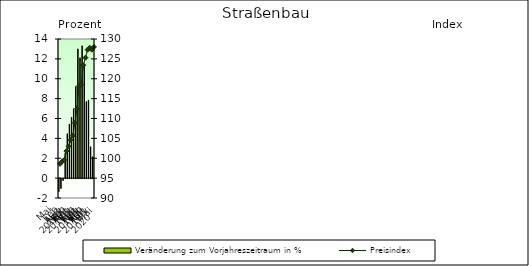
| Category | Veränderung zum Vorjahreszeitraum in % |
|---|---|
| 0 | -1.301 |
| 1 | -0.998 |
| 2 | -0.2 |
| 3 | 2.518 |
| 4 | 4.462 |
| 5 | 5.444 |
| 6 | 6.124 |
| 7 | 6.974 |
| 8 | 9.223 |
| 9 | 13.002 |
| 10 | 12.11 |
| 11 | 13.315 |
| 12 | 11.378 |
| 13 | 7.699 |
| 14 | 7.848 |
| 15 | 3.16 |
| 16 | 2.155 |